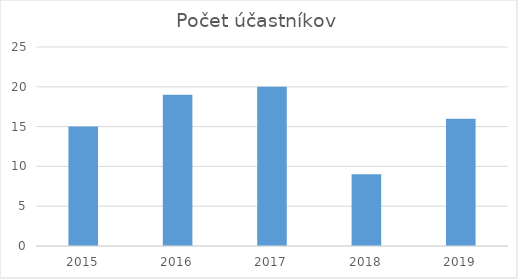
| Category | Series 0 |
|---|---|
| 2015.0 | 15 |
| 2016.0 | 19 |
| 2017.0 | 20 |
| 2018.0 | 9 |
| 2019.0 | 16 |